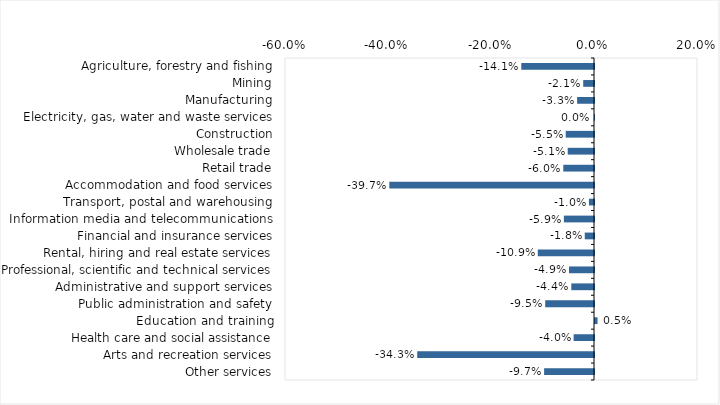
| Category | This week |
|---|---|
| Agriculture, forestry and fishing | -0.141 |
| Mining | -0.021 |
| Manufacturing | -0.033 |
| Electricity, gas, water and waste services | 0 |
| Construction | -0.055 |
| Wholesale trade | -0.051 |
| Retail trade | -0.06 |
| Accommodation and food services | -0.397 |
| Transport, postal and warehousing | -0.01 |
| Information media and telecommunications | -0.059 |
| Financial and insurance services | -0.018 |
| Rental, hiring and real estate services | -0.109 |
| Professional, scientific and technical services | -0.049 |
| Administrative and support services | -0.044 |
| Public administration and safety | -0.095 |
| Education and training | 0.005 |
| Health care and social assistance | -0.04 |
| Arts and recreation services | -0.343 |
| Other services | -0.097 |